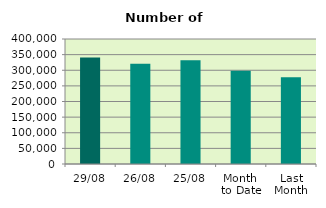
| Category | Series 0 |
|---|---|
| 29/08 | 341036 |
| 26/08 | 320916 |
| 25/08 | 331810 |
| Month 
to Date | 298778.762 |
| Last
Month | 277312.476 |